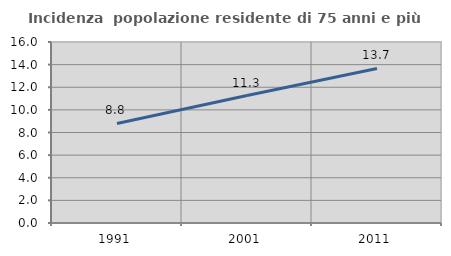
| Category | Incidenza  popolazione residente di 75 anni e più |
|---|---|
| 1991.0 | 8.798 |
| 2001.0 | 11.265 |
| 2011.0 | 13.665 |